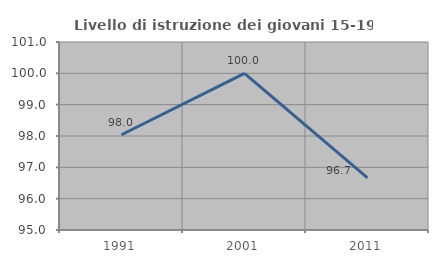
| Category | Livello di istruzione dei giovani 15-19 anni |
|---|---|
| 1991.0 | 98.039 |
| 2001.0 | 100 |
| 2011.0 | 96.667 |